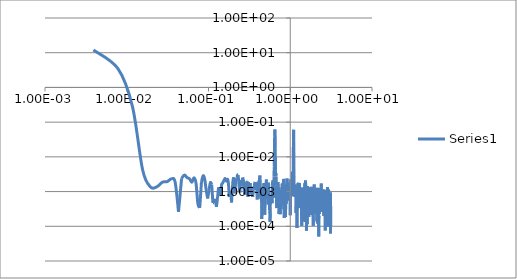
| Category | Series 0 |
|---|---|
| 0.00390625 | 11.981 |
| 0.0078125 | 3.469 |
| 0.01171875 | 0.286 |
| 0.015625 | 0.004 |
| 0.01953125 | 0.001 |
| 0.0234375 | 0.001 |
| 0.02734375 | 0.002 |
| 0.03125 | 0.002 |
| 0.03515625 | 0.002 |
| 0.0390625 | 0.002 |
| 0.04296875 | 0 |
| 0.046875 | 0.002 |
| 0.05078125 | 0.003 |
| 0.0546875 | 0.003 |
| 0.05859375 | 0.002 |
| 0.0625 | 0.002 |
| 0.06640625 | 0.002 |
| 0.0703125 | 0.002 |
| 0.07421875 | 0 |
| 0.078125 | 0 |
| 0.08203125 | 0.002 |
| 0.0859375 | 0.003 |
| 0.08984375 | 0.002 |
| 0.09375 | 0.001 |
| 0.09765625 | 0.001 |
| 0.1015625 | 0.001 |
| 0.1054688 | 0.002 |
| 0.109375 | 0.002 |
| 0.1132813 | 0 |
| 0.1171875 | 0 |
| 0.1210938 | 0.001 |
| 0.125 | 0 |
| 0.1289063 | 0.001 |
| 0.1328125 | 0.001 |
| 0.1367188 | 0.001 |
| 0.140625 | 0.001 |
| 0.1445313 | 0.002 |
| 0.1484375 | 0.002 |
| 0.1523438 | 0.002 |
| 0.15625 | 0.002 |
| 0.1601563 | 0.002 |
| 0.1640625 | 0.002 |
| 0.1679688 | 0.002 |
| 0.171875 | 0.002 |
| 0.1757813 | 0.002 |
| 0.1796875 | 0.001 |
| 0.1835938 | 0.001 |
| 0.1875 | 0.001 |
| 0.1914063 | 0 |
| 0.1953125 | 0.001 |
| 0.1992188 | 0.002 |
| 0.203125 | 0.003 |
| 0.2070313 | 0.002 |
| 0.2109375 | 0.001 |
| 0.2148438 | 0.002 |
| 0.21875 | 0.002 |
| 0.2226563 | 0.002 |
| 0.2265625 | 0.003 |
| 0.2304688 | 0.003 |
| 0.234375 | 0.002 |
| 0.2382813 | 0.001 |
| 0.2421875 | 0.001 |
| 0.2460938 | 0.002 |
| 0.25 | 0.002 |
| 0.2539063 | 0.001 |
| 0.2578125 | 0.002 |
| 0.2617188 | 0.003 |
| 0.265625 | 0.002 |
| 0.2695313 | 0.002 |
| 0.2734375 | 0.001 |
| 0.2773438 | 0.001 |
| 0.28125 | 0.002 |
| 0.2851563 | 0.001 |
| 0.2890625 | 0.001 |
| 0.2929688 | 0.002 |
| 0.296875 | 0.002 |
| 0.3007813 | 0.001 |
| 0.3046875 | 0.001 |
| 0.3085938 | 0.002 |
| 0.3125 | 0.002 |
| 0.3164063 | 0.001 |
| 0.3203125 | 0.001 |
| 0.3242188 | 0.002 |
| 0.328125 | 0.001 |
| 0.3320313 | 0.001 |
| 0.3359375 | 0.001 |
| 0.3398438 | 0.001 |
| 0.34375 | 0.001 |
| 0.3476563 | 0.001 |
| 0.3515625 | 0.001 |
| 0.3554688 | 0.001 |
| 0.359375 | 0.001 |
| 0.3632813 | 0.001 |
| 0.3671875 | 0.002 |
| 0.3710938 | 0.002 |
| 0.375 | 0.001 |
| 0.3789063 | 0.001 |
| 0.3828125 | 0.002 |
| 0.3867188 | 0.002 |
| 0.390625 | 0.001 |
| 0.3945313 | 0.001 |
| 0.3984375 | 0.001 |
| 0.4023438 | 0.002 |
| 0.40625 | 0.002 |
| 0.4101563 | 0.001 |
| 0.4140625 | 0.001 |
| 0.4179688 | 0.001 |
| 0.421875 | 0.002 |
| 0.4257813 | 0.003 |
| 0.4296875 | 0.002 |
| 0.4335938 | 0.001 |
| 0.4375 | 0.001 |
| 0.4414063 | 0.001 |
| 0.4453125 | 0.001 |
| 0.4492188 | 0 |
| 0.453125 | 0.001 |
| 0.4570313 | 0.001 |
| 0.4609375 | 0.001 |
| 0.4648438 | 0 |
| 0.46875 | 0.001 |
| 0.4726563 | 0.002 |
| 0.4765625 | 0.002 |
| 0.4804688 | 0.001 |
| 0.484375 | 0.001 |
| 0.4882813 | 0 |
| 0.4921875 | 0.001 |
| 0.4960938 | 0.002 |
| 0.5 | 0.001 |
| 0.5039063 | 0.001 |
| 0.5078125 | 0.002 |
| 0.5117188 | 0.002 |
| 0.515625 | 0.002 |
| 0.5195313 | 0.001 |
| 0.5234375 | 0.001 |
| 0.5273438 | 0.002 |
| 0.53125 | 0.001 |
| 0.5351563 | 0 |
| 0.5390625 | 0.002 |
| 0.5429688 | 0.002 |
| 0.546875 | 0.001 |
| 0.5507813 | 0.001 |
| 0.5546875 | 0.001 |
| 0.5585938 | 0 |
| 0.5625 | 0 |
| 0.5664063 | 0 |
| 0.5703125 | 0 |
| 0.5742188 | 0.001 |
| 0.578125 | 0.001 |
| 0.5820313 | 0.001 |
| 0.5859375 | 0.001 |
| 0.5898438 | 0.001 |
| 0.59375 | 0.001 |
| 0.5976563 | 0 |
| 0.6015625 | 0 |
| 0.6054688 | 0.002 |
| 0.609375 | 0.002 |
| 0.6132813 | 0.002 |
| 0.6171875 | 0.002 |
| 0.6210938 | 0.001 |
| 0.625 | 0.001 |
| 0.6289063 | 0.002 |
| 0.6328125 | 0.003 |
| 0.6367188 | 0.005 |
| 0.640625 | 0.014 |
| 0.6445313 | 0.039 |
| 0.6484375 | 0.061 |
| 0.6523438 | 0.048 |
| 0.65625 | 0.018 |
| 0.6601563 | 0.004 |
| 0.6640625 | 0.003 |
| 0.6679688 | 0.003 |
| 0.671875 | 0.003 |
| 0.6757813 | 0.001 |
| 0.6796875 | 0.001 |
| 0.6835938 | 0 |
| 0.6875 | 0.001 |
| 0.6914063 | 0.001 |
| 0.6953125 | 0.001 |
| 0.6992188 | 0.001 |
| 0.703125 | 0.001 |
| 0.7070313 | 0.002 |
| 0.7109375 | 0.002 |
| 0.7148438 | 0.001 |
| 0.71875 | 0.001 |
| 0.7226563 | 0.001 |
| 0.7265625 | 0.001 |
| 0.7304688 | 0 |
| 0.734375 | 0.001 |
| 0.7382813 | 0.001 |
| 0.7421875 | 0.001 |
| 0.7460938 | 0 |
| 0.75 | 0 |
| 0.7539063 | 0 |
| 0.7578125 | 0.001 |
| 0.7617188 | 0.001 |
| 0.765625 | 0 |
| 0.7695313 | 0 |
| 0.7734375 | 0.001 |
| 0.7773438 | 0.001 |
| 0.78125 | 0.001 |
| 0.7851563 | 0.001 |
| 0.7890625 | 0.001 |
| 0.7929688 | 0.001 |
| 0.796875 | 0.002 |
| 0.8007813 | 0.002 |
| 0.8046875 | 0.001 |
| 0.8085938 | 0.001 |
| 0.8125 | 0.001 |
| 0.8164063 | 0.001 |
| 0.8203125 | 0.001 |
| 0.8242188 | 0 |
| 0.828125 | 0.002 |
| 0.8320313 | 0.002 |
| 0.8359375 | 0.002 |
| 0.8398438 | 0 |
| 0.84375 | 0 |
| 0.8476563 | 0 |
| 0.8515625 | 0 |
| 0.8554688 | 0 |
| 0.859375 | 0.001 |
| 0.8632813 | 0 |
| 0.8671875 | 0 |
| 0.8710938 | 0.001 |
| 0.875 | 0 |
| 0.8789063 | 0 |
| 0.8828125 | 0.001 |
| 0.8867188 | 0.001 |
| 0.890625 | 0.001 |
| 0.8945313 | 0 |
| 0.8984375 | 0.001 |
| 0.9023438 | 0.002 |
| 0.90625 | 0.002 |
| 0.9101563 | 0.002 |
| 0.9140625 | 0.002 |
| 0.9179688 | 0.002 |
| 0.921875 | 0.001 |
| 0.9257813 | 0.001 |
| 0.9296875 | 0.001 |
| 0.9335938 | 0.002 |
| 0.9375 | 0.002 |
| 0.9414063 | 0.001 |
| 0.9453125 | 0.001 |
| 0.9492188 | 0.001 |
| 0.953125 | 0.001 |
| 0.9570313 | 0.001 |
| 0.9609375 | 0.001 |
| 0.9648438 | 0.002 |
| 0.96875 | 0.002 |
| 0.9726563 | 0.002 |
| 0.9765625 | 0.002 |
| 0.9804688 | 0.002 |
| 0.984375 | 0.001 |
| 0.9882813 | 0.001 |
| 0.9921875 | 0.001 |
| 0.9960938 | 0.001 |
| 1.0 | 0 |
| 1.003906 | 0.001 |
| 1.007813 | 0.002 |
| 1.011719 | 0.002 |
| 1.015625 | 0.002 |
| 1.019531 | 0.002 |
| 1.023438 | 0.002 |
| 1.027344 | 0.002 |
| 1.03125 | 0.001 |
| 1.035156 | 0.001 |
| 1.039063 | 0.001 |
| 1.042969 | 0.001 |
| 1.046875 | 0.001 |
| 1.050781 | 0.002 |
| 1.054688 | 0.002 |
| 1.058594 | 0.003 |
| 1.0625 | 0.004 |
| 1.066406 | 0.004 |
| 1.070313 | 0.003 |
| 1.074219 | 0.001 |
| 1.078125 | 0.001 |
| 1.082031 | 0.002 |
| 1.085938 | 0.006 |
| 1.089844 | 0.011 |
| 1.09375 | 0.028 |
| 1.097656 | 0.058 |
| 1.101563 | 0.061 |
| 1.105469 | 0.026 |
| 1.109375 | 0.003 |
| 1.113281 | 0.003 |
| 1.117188 | 0.001 |
| 1.121094 | 0.001 |
| 1.125 | 0.001 |
| 1.128906 | 0.001 |
| 1.132813 | 0.001 |
| 1.136719 | 0.001 |
| 1.140625 | 0.001 |
| 1.144531 | 0.001 |
| 1.148438 | 0.001 |
| 1.152344 | 0.001 |
| 1.15625 | 0.001 |
| 1.160156 | 0.002 |
| 1.164063 | 0.001 |
| 1.167969 | 0.001 |
| 1.171875 | 0.001 |
| 1.175781 | 0 |
| 1.179688 | 0 |
| 1.183594 | 0.001 |
| 1.1875 | 0.001 |
| 1.191406 | 0.001 |
| 1.195313 | 0.001 |
| 1.199219 | 0.001 |
| 1.203125 | 0.001 |
| 1.207031 | 0.001 |
| 1.210938 | 0 |
| 1.214844 | 0 |
| 1.21875 | 0 |
| 1.222656 | 0.001 |
| 1.226563 | 0.001 |
| 1.230469 | 0 |
| 1.234375 | 0 |
| 1.238281 | 0.001 |
| 1.242188 | 0.001 |
| 1.246094 | 0.002 |
| 1.25 | 0.002 |
| 1.253906 | 0.002 |
| 1.257813 | 0.001 |
| 1.261719 | 0.001 |
| 1.265625 | 0.001 |
| 1.269531 | 0.001 |
| 1.273438 | 0.001 |
| 1.277344 | 0.001 |
| 1.28125 | 0.001 |
| 1.285156 | 0.001 |
| 1.289063 | 0.001 |
| 1.292969 | 0.002 |
| 1.296875 | 0.002 |
| 1.300781 | 0.001 |
| 1.304688 | 0.001 |
| 1.308594 | 0.001 |
| 1.3125 | 0 |
| 1.316406 | 0 |
| 1.320313 | 0 |
| 1.324219 | 0 |
| 1.328125 | 0.001 |
| 1.332031 | 0.001 |
| 1.335938 | 0.001 |
| 1.339844 | 0.001 |
| 1.34375 | 0.001 |
| 1.347656 | 0.001 |
| 1.351563 | 0.001 |
| 1.355469 | 0.001 |
| 1.359375 | 0.001 |
| 1.363281 | 0 |
| 1.367188 | 0 |
| 1.371094 | 0.001 |
| 1.375 | 0.001 |
| 1.378906 | 0 |
| 1.382813 | 0 |
| 1.386719 | 0 |
| 1.390625 | 0 |
| 1.394531 | 0 |
| 1.398438 | 0.001 |
| 1.402344 | 0.001 |
| 1.40625 | 0.001 |
| 1.410156 | 0.001 |
| 1.414063 | 0 |
| 1.417969 | 0.001 |
| 1.421875 | 0 |
| 1.425781 | 0.001 |
| 1.429688 | 0.001 |
| 1.433594 | 0.001 |
| 1.4375 | 0.001 |
| 1.441406 | 0 |
| 1.445313 | 0 |
| 1.449219 | 0.001 |
| 1.453125 | 0.001 |
| 1.457031 | 0.001 |
| 1.460938 | 0.001 |
| 1.464844 | 0 |
| 1.46875 | 0 |
| 1.472656 | 0.001 |
| 1.476563 | 0.001 |
| 1.480469 | 0.001 |
| 1.484375 | 0.001 |
| 1.488281 | 0.001 |
| 1.492188 | 0.001 |
| 1.496094 | 0.001 |
| 1.5 | 0.001 |
| 1.503906 | 0.001 |
| 1.507813 | 0.002 |
| 1.511719 | 0.002 |
| 1.515625 | 0.001 |
| 1.519531 | 0.001 |
| 1.523438 | 0 |
| 1.527344 | 0.001 |
| 1.53125 | 0.001 |
| 1.535156 | 0.002 |
| 1.539063 | 0.002 |
| 1.542969 | 0.002 |
| 1.546875 | 0.001 |
| 1.550781 | 0.001 |
| 1.554688 | 0.001 |
| 1.558594 | 0 |
| 1.5625 | 0 |
| 1.566406 | 0.001 |
| 1.570313 | 0.001 |
| 1.574219 | 0.001 |
| 1.578125 | 0 |
| 1.582031 | 0 |
| 1.585938 | 0 |
| 1.589844 | 0 |
| 1.59375 | 0.001 |
| 1.597656 | 0.001 |
| 1.601563 | 0.001 |
| 1.605469 | 0 |
| 1.609375 | 0 |
| 1.613281 | 0 |
| 1.617188 | 0.001 |
| 1.621094 | 0 |
| 1.625 | 0.001 |
| 1.628906 | 0.001 |
| 1.632813 | 0.001 |
| 1.636719 | 0 |
| 1.640625 | 0.001 |
| 1.644531 | 0.001 |
| 1.648438 | 0.001 |
| 1.652344 | 0.001 |
| 1.65625 | 0 |
| 1.660156 | 0.001 |
| 1.664063 | 0.001 |
| 1.667969 | 0.001 |
| 1.671875 | 0.001 |
| 1.675781 | 0.001 |
| 1.679688 | 0.001 |
| 1.683594 | 0 |
| 1.6875 | 0.001 |
| 1.691406 | 0.001 |
| 1.695313 | 0 |
| 1.699219 | 0 |
| 1.703125 | 0 |
| 1.707031 | 0 |
| 1.710938 | 0.001 |
| 1.714844 | 0.001 |
| 1.71875 | 0.001 |
| 1.722656 | 0.001 |
| 1.726563 | 0.001 |
| 1.730469 | 0.001 |
| 1.734375 | 0.001 |
| 1.738281 | 0.001 |
| 1.742188 | 0.001 |
| 1.746094 | 0.001 |
| 1.75 | 0.001 |
| 1.753906 | 0.001 |
| 1.757813 | 0.001 |
| 1.761719 | 0.001 |
| 1.765625 | 0.001 |
| 1.769531 | 0.001 |
| 1.773438 | 0.001 |
| 1.777344 | 0.001 |
| 1.78125 | 0.001 |
| 1.785156 | 0 |
| 1.789063 | 0 |
| 1.792969 | 0.001 |
| 1.796875 | 0.001 |
| 1.800781 | 0.001 |
| 1.804688 | 0 |
| 1.808594 | 0.001 |
| 1.8125 | 0.001 |
| 1.816406 | 0.001 |
| 1.820313 | 0 |
| 1.824219 | 0 |
| 1.828125 | 0 |
| 1.832031 | 0.001 |
| 1.835938 | 0.001 |
| 1.839844 | 0.001 |
| 1.84375 | 0.001 |
| 1.847656 | 0.001 |
| 1.851563 | 0.001 |
| 1.855469 | 0.001 |
| 1.859375 | 0 |
| 1.863281 | 0.001 |
| 1.867188 | 0.001 |
| 1.871094 | 0 |
| 1.875 | 0 |
| 1.878906 | 0.001 |
| 1.882813 | 0.001 |
| 1.886719 | 0.001 |
| 1.890625 | 0.001 |
| 1.894531 | 0 |
| 1.898438 | 0.001 |
| 1.902344 | 0.001 |
| 1.90625 | 0 |
| 1.910156 | 0 |
| 1.914063 | 0.001 |
| 1.917969 | 0.001 |
| 1.921875 | 0.001 |
| 1.925781 | 0 |
| 1.929688 | 0.001 |
| 1.933594 | 0.001 |
| 1.9375 | 0 |
| 1.941406 | 0.001 |
| 1.945313 | 0.001 |
| 1.949219 | 0.001 |
| 1.953125 | 0.001 |
| 1.957031 | 0 |
| 1.960938 | 0.001 |
| 1.964844 | 0.002 |
| 1.96875 | 0.001 |
| 1.972656 | 0 |
| 1.976563 | 0.001 |
| 1.980469 | 0.001 |
| 1.984375 | 0 |
| 1.988281 | 0 |
| 1.992188 | 0.001 |
| 1.996094 | 0.001 |
| 2.0 | 0.001 |
| 2.003906 | 0.001 |
| 2.007813 | 0 |
| 2.011719 | 0 |
| 2.015625 | 0.001 |
| 2.019531 | 0.001 |
| 2.023438 | 0 |
| 2.027344 | 0.001 |
| 2.03125 | 0.001 |
| 2.035156 | 0 |
| 2.039063 | 0.001 |
| 2.042969 | 0.001 |
| 2.046875 | 0.001 |
| 2.050781 | 0.001 |
| 2.054688 | 0.001 |
| 2.058594 | 0.001 |
| 2.0625 | 0 |
| 2.066406 | 0.001 |
| 2.070313 | 0 |
| 2.074219 | 0 |
| 2.078125 | 0 |
| 2.082031 | 0 |
| 2.085938 | 0 |
| 2.089844 | 0 |
| 2.09375 | 0 |
| 2.097656 | 0 |
| 2.101563 | 0.001 |
| 2.105469 | 0.001 |
| 2.109375 | 0.001 |
| 2.113281 | 0.001 |
| 2.117188 | 0 |
| 2.121094 | 0.001 |
| 2.125 | 0 |
| 2.128906 | 0.001 |
| 2.132813 | 0.001 |
| 2.136719 | 0.001 |
| 2.140625 | 0 |
| 2.144531 | 0 |
| 2.148438 | 0 |
| 2.152344 | 0 |
| 2.15625 | 0 |
| 2.160156 | 0 |
| 2.164063 | 0 |
| 2.167969 | 0 |
| 2.171875 | 0.001 |
| 2.175781 | 0.001 |
| 2.179688 | 0.001 |
| 2.183594 | 0.001 |
| 2.1875 | 0 |
| 2.191406 | 0.001 |
| 2.195313 | 0.001 |
| 2.199219 | 0.001 |
| 2.203125 | 0.001 |
| 2.207031 | 0 |
| 2.210938 | 0.001 |
| 2.214844 | 0.001 |
| 2.21875 | 0.001 |
| 2.222656 | 0 |
| 2.226563 | 0 |
| 2.230469 | 0 |
| 2.234375 | 0 |
| 2.238281 | 0 |
| 2.242188 | 0.001 |
| 2.246094 | 0.001 |
| 2.25 | 0.001 |
| 2.253906 | 0.001 |
| 2.257813 | 0.001 |
| 2.261719 | 0.001 |
| 2.265625 | 0 |
| 2.269531 | 0 |
| 2.273438 | 0.001 |
| 2.277344 | 0.001 |
| 2.28125 | 0.001 |
| 2.285156 | 0.001 |
| 2.289063 | 0.001 |
| 2.292969 | 0.001 |
| 2.296875 | 0.001 |
| 2.300781 | 0.001 |
| 2.304688 | 0.001 |
| 2.308594 | 0 |
| 2.3125 | 0.001 |
| 2.316406 | 0.001 |
| 2.320313 | 0.001 |
| 2.324219 | 0 |
| 2.328125 | 0.001 |
| 2.332031 | 0.001 |
| 2.335938 | 0 |
| 2.339844 | 0.001 |
| 2.34375 | 0.001 |
| 2.347656 | 0.001 |
| 2.351563 | 0.001 |
| 2.355469 | 0.001 |
| 2.359375 | 0 |
| 2.363281 | 0 |
| 2.367188 | 0.001 |
| 2.371094 | 0.001 |
| 2.375 | 0.001 |
| 2.378906 | 0.001 |
| 2.382813 | 0.001 |
| 2.386719 | 0.001 |
| 2.390625 | 0 |
| 2.394531 | 0.001 |
| 2.398438 | 0.002 |
| 2.402344 | 0.001 |
| 2.40625 | 0.001 |
| 2.410156 | 0 |
| 2.414063 | 0.001 |
| 2.417969 | 0.001 |
| 2.421875 | 0.001 |
| 2.425781 | 0.001 |
| 2.429688 | 0.001 |
| 2.433594 | 0.001 |
| 2.4375 | 0 |
| 2.441406 | 0 |
| 2.445313 | 0.001 |
| 2.449219 | 0.001 |
| 2.453125 | 0.001 |
| 2.457031 | 0.001 |
| 2.460938 | 0.001 |
| 2.464844 | 0.001 |
| 2.46875 | 0.001 |
| 2.472656 | 0.001 |
| 2.476563 | 0.001 |
| 2.480469 | 0.001 |
| 2.484375 | 0.001 |
| 2.488281 | 0.001 |
| 2.492188 | 0.001 |
| 2.496094 | 0.001 |
| 2.5 | 0.001 |
| 2.503906 | 0.001 |
| 2.507813 | 0.001 |
| 2.511719 | 0 |
| 2.515625 | 0.001 |
| 2.519531 | 0.001 |
| 2.523438 | 0.001 |
| 2.527344 | 0.001 |
| 2.53125 | 0.001 |
| 2.535156 | 0 |
| 2.539063 | 0 |
| 2.542969 | 0.001 |
| 2.546875 | 0 |
| 2.550781 | 0 |
| 2.554688 | 0 |
| 2.558594 | 0 |
| 2.5625 | 0 |
| 2.566406 | 0 |
| 2.570313 | 0 |
| 2.574219 | 0 |
| 2.578125 | 0.001 |
| 2.582031 | 0.001 |
| 2.585938 | 0.001 |
| 2.589844 | 0.001 |
| 2.59375 | 0.001 |
| 2.597656 | 0 |
| 2.601563 | 0 |
| 2.605469 | 0 |
| 2.609375 | 0.001 |
| 2.613281 | 0 |
| 2.617188 | 0.001 |
| 2.621094 | 0.001 |
| 2.625 | 0.001 |
| 2.628906 | 0.001 |
| 2.632813 | 0 |
| 2.636719 | 0 |
| 2.640625 | 0 |
| 2.644531 | 0 |
| 2.648438 | 0.001 |
| 2.652344 | 0 |
| 2.65625 | 0 |
| 2.660156 | 0.001 |
| 2.664063 | 0 |
| 2.667969 | 0 |
| 2.671875 | 0.001 |
| 2.675781 | 0.001 |
| 2.679688 | 0 |
| 2.683594 | 0.001 |
| 2.6875 | 0.001 |
| 2.691406 | 0 |
| 2.695313 | 0 |
| 2.699219 | 0 |
| 2.703125 | 0 |
| 2.707031 | 0 |
| 2.710938 | 0 |
| 2.714844 | 0 |
| 2.71875 | 0 |
| 2.722656 | 0.001 |
| 2.726563 | 0.001 |
| 2.730469 | 0.001 |
| 2.734375 | 0 |
| 2.738281 | 0.001 |
| 2.742188 | 0 |
| 2.746094 | 0 |
| 2.75 | 0.001 |
| 2.753906 | 0.001 |
| 2.757813 | 0.001 |
| 2.761719 | 0.001 |
| 2.765625 | 0.001 |
| 2.769531 | 0 |
| 2.773438 | 0.001 |
| 2.777344 | 0.001 |
| 2.78125 | 0.001 |
| 2.785156 | 0 |
| 2.789063 | 0 |
| 2.792969 | 0 |
| 2.796875 | 0 |
| 2.800781 | 0 |
| 2.804688 | 0 |
| 2.808594 | 0.001 |
| 2.8125 | 0.001 |
| 2.816406 | 0 |
| 2.820313 | 0 |
| 2.824219 | 0.001 |
| 2.828125 | 0.001 |
| 2.832031 | 0.001 |
| 2.835938 | 0 |
| 2.839844 | 0 |
| 2.84375 | 0.001 |
| 2.847656 | 0.001 |
| 2.851563 | 0.001 |
| 2.855469 | 0 |
| 2.859375 | 0 |
| 2.863281 | 0.001 |
| 2.867188 | 0 |
| 2.871094 | 0 |
| 2.875 | 0 |
| 2.878906 | 0 |
| 2.882813 | 0 |
| 2.886719 | 0 |
| 2.890625 | 0 |
| 2.894531 | 0.001 |
| 2.898438 | 0.001 |
| 2.902344 | 0.001 |
| 2.90625 | 0.001 |
| 2.910156 | 0.001 |
| 2.914063 | 0.001 |
| 2.917969 | 0.001 |
| 2.921875 | 0.001 |
| 2.925781 | 0 |
| 2.929688 | 0 |
| 2.933594 | 0 |
| 2.9375 | 0 |
| 2.941406 | 0.001 |
| 2.945313 | 0.001 |
| 2.949219 | 0.001 |
| 2.953125 | 0 |
| 2.957031 | 0.001 |
| 2.960938 | 0.001 |
| 2.964844 | 0.001 |
| 2.96875 | 0.001 |
| 2.972656 | 0 |
| 2.976563 | 0 |
| 2.980469 | 0 |
| 2.984375 | 0 |
| 2.988281 | 0.001 |
| 2.992188 | 0 |
| 2.996094 | 0.001 |
| 3.0 | 0.001 |
| 3.003906 | 0.001 |
| 3.007813 | 0 |
| 3.011719 | 0 |
| 3.015625 | 0 |
| 3.019531 | 0 |
| 3.023438 | 0.001 |
| 3.027344 | 0.001 |
| 3.03125 | 0 |
| 3.035156 | 0 |
| 3.039063 | 0.001 |
| 3.042969 | 0 |
| 3.046875 | 0.001 |
| 3.050781 | 0 |
| 3.054688 | 0 |
| 3.058594 | 0 |
| 3.0625 | 0 |
| 3.066406 | 0 |
| 3.070313 | 0 |
| 3.074219 | 0 |
| 3.078125 | 0.001 |
| 3.082031 | 0 |
| 3.085938 | 0 |
| 3.089844 | 0.001 |
| 3.09375 | 0.001 |
| 3.097656 | 0 |
| 3.101563 | 0.001 |
| 3.105469 | 0.001 |
| 3.109375 | 0.001 |
| 3.113281 | 0 |
| 3.117188 | 0 |
| 3.121094 | 0 |
| 3.125 | 0 |